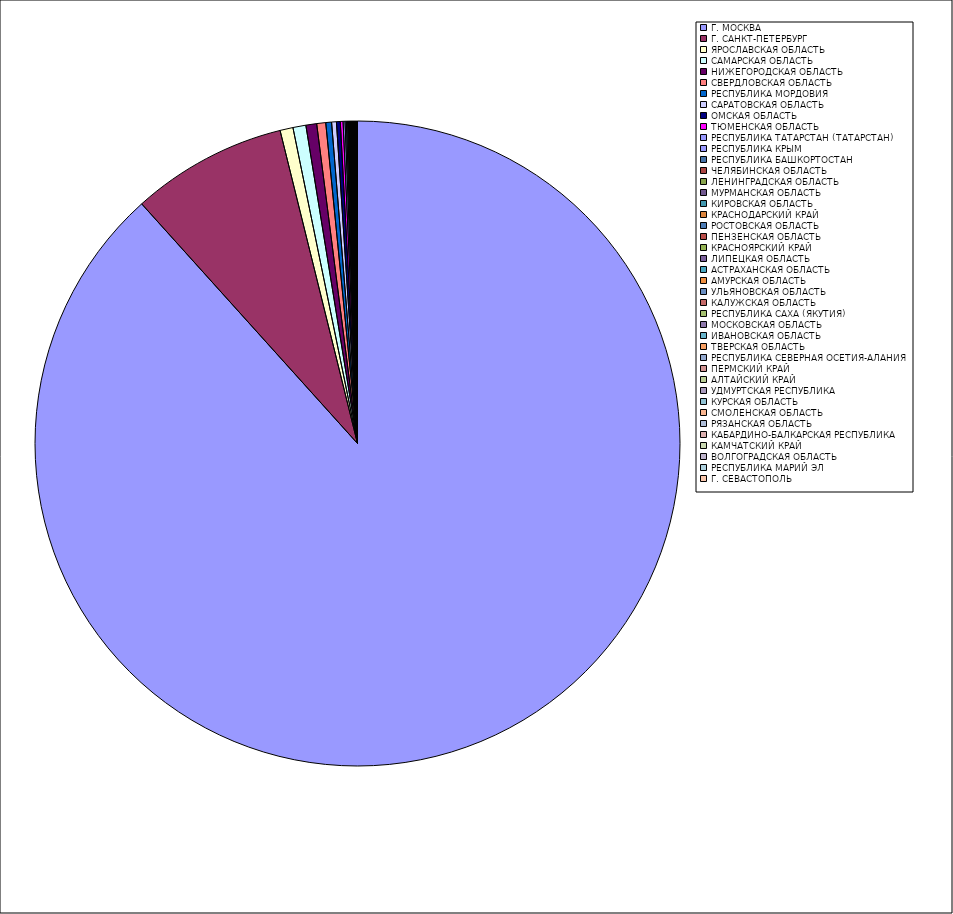
| Category | Оборот |
|---|---|
| Г. МОСКВА | 88.297 |
| Г. САНКТ-ПЕТЕРБУРГ | 7.807 |
| ЯРОСЛАВСКАЯ ОБЛАСТЬ | 0.65 |
| САМАРСКАЯ ОБЛАСТЬ | 0.648 |
| НИЖЕГОРОДСКАЯ ОБЛАСТЬ | 0.54 |
| СВЕРДЛОВСКАЯ ОБЛАСТЬ | 0.45 |
| РЕСПУБЛИКА МОРДОВИЯ | 0.29 |
| САРАТОВСКАЯ ОБЛАСТЬ | 0.24 |
| ОМСКАЯ ОБЛАСТЬ | 0.191 |
| ТЮМЕНСКАЯ ОБЛАСТЬ | 0.138 |
| РЕСПУБЛИКА ТАТАРСТАН (ТАТАРСТАН) | 0.097 |
| РЕСПУБЛИКА КРЫМ | 0.064 |
| РЕСПУБЛИКА БАШКОРТОСТАН | 0.059 |
| ЧЕЛЯБИНСКАЯ ОБЛАСТЬ | 0.044 |
| ЛЕНИНГРАДСКАЯ ОБЛАСТЬ | 0.039 |
| МУРМАНСКАЯ ОБЛАСТЬ | 0.031 |
| КИРОВСКАЯ ОБЛАСТЬ | 0.03 |
| КРАСНОДАРСКИЙ КРАЙ | 0.027 |
| РОСТОВСКАЯ ОБЛАСТЬ | 0.027 |
| ПЕНЗЕНСКАЯ ОБЛАСТЬ | 0.026 |
| КРАСНОЯРСКИЙ КРАЙ | 0.025 |
| ЛИПЕЦКАЯ ОБЛАСТЬ | 0.02 |
| АСТРАХАНСКАЯ ОБЛАСТЬ | 0.017 |
| АМУРСКАЯ ОБЛАСТЬ | 0.017 |
| УЛЬЯНОВСКАЯ ОБЛАСТЬ | 0.015 |
| КАЛУЖСКАЯ ОБЛАСТЬ | 0.014 |
| РЕСПУБЛИКА САХА (ЯКУТИЯ) | 0.014 |
| МОСКОВСКАЯ ОБЛАСТЬ | 0.014 |
| ИВАНОВСКАЯ ОБЛАСТЬ | 0.014 |
| ТВЕРСКАЯ ОБЛАСТЬ | 0.012 |
| РЕСПУБЛИКА СЕВЕРНАЯ ОСЕТИЯ-АЛАНИЯ | 0.012 |
| ПЕРМСКИЙ КРАЙ | 0.012 |
| АЛТАЙСКИЙ КРАЙ | 0.012 |
| УДМУРТСКАЯ РЕСПУБЛИКА | 0.01 |
| КУРСКАЯ ОБЛАСТЬ | 0.01 |
| СМОЛЕНСКАЯ ОБЛАСТЬ | 0.009 |
| РЯЗАНСКАЯ ОБЛАСТЬ | 0.008 |
| КАБАРДИНО-БАЛКАРСКАЯ РЕСПУБЛИКА | 0.007 |
| КАМЧАТСКИЙ КРАЙ | 0.007 |
| ВОЛГОГРАДСКАЯ ОБЛАСТЬ | 0.007 |
| РЕСПУБЛИКА МАРИЙ ЭЛ | 0.006 |
| Г. СЕВАСТОПОЛЬ | 0.005 |